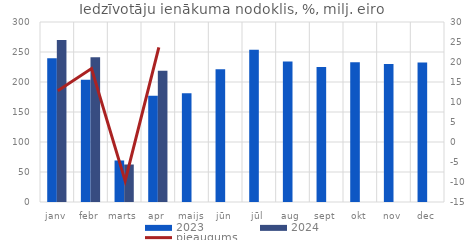
| Category | 2023 | 2024 |
|---|---|---|
| janv | 239.534 | 270.152 |
| febr | 203.945 | 241.398 |
| marts | 69.21 | 62.493 |
| apr | 176.948 | 218.77 |
| maijs | 181.073 | 0 |
| jūn | 221.435 | 0 |
| jūl | 253.867 | 0 |
| aug | 234.132 | 0 |
| sept | 225.118 | 0 |
| okt | 233.046 | 0 |
| nov | 229.983 | 0 |
| dec | 232.44 | 0 |